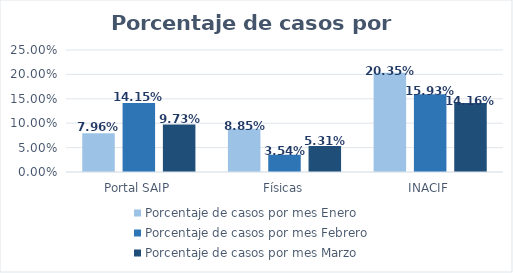
| Category | Porcentaje de casos por mes |
|---|---|
| Portal SAIP | 0.097 |
| Físicas | 0.053 |
| INACIF | 0.142 |